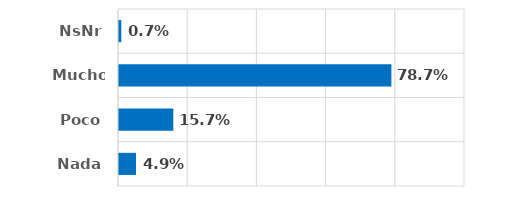
| Category | Series 0 |
|---|---|
| Nada | 0.049 |
| Poco | 0.157 |
| Mucho | 0.787 |
| NsNr | 0.007 |